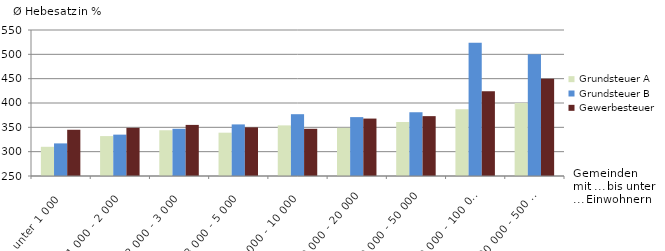
| Category | Grundsteuer A | Grundsteuer B | Gewerbesteuer |
|---|---|---|---|
| unter 1 000 | 310 | 317 | 345 |
| 1 000 - 2 000 | 332 | 335 | 349 |
| 2 000 - 3 000 | 344 | 347 | 355 |
| 3 000 - 5 000 | 339 | 356 | 350 |
| 5 000 - 10 000 | 354 | 377 | 347 |
| 10 000 - 20 000 | 349 | 371 | 368 |
| 20 000 - 50 000 | 361 | 381 | 373 |
| 50 000 - 100 000 | 387 | 524 | 424 |
| 200 000 - 500 000 | 400 | 500 | 450 |